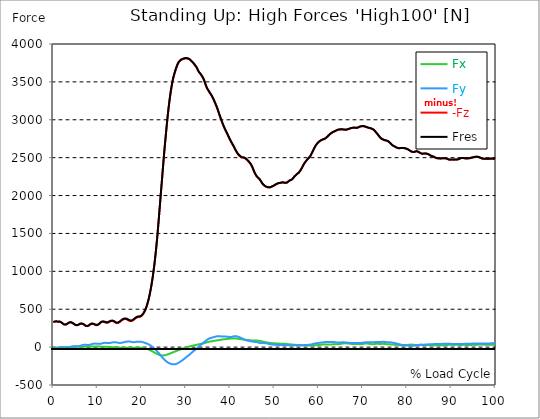
| Category |  Fx |  Fy |  -Fz |  Fres |
|---|---|---|---|---|
| 0.0 | -2.486 | -16.897 | 330.378 | 330.988 |
| 0.167348456675344 | -2.66 | -15.938 | 332.776 | 333.299 |
| 0.334696913350688 | -3.358 | -15.131 | 337.093 | 337.573 |
| 0.5020453700260321 | -3.99 | -14.106 | 340.407 | 340.821 |
| 0.669393826701376 | -4.361 | -12.449 | 340.581 | 340.93 |
| 0.83674228337672 | -3.881 | -12.384 | 336.853 | 337.202 |
| 1.0040907400520642 | -3.597 | -12.428 | 334.302 | 334.629 |
| 1.1621420602454444 | -4.252 | -11.054 | 336.831 | 337.136 |
| 1.3294905169207885 | -4.644 | -9.528 | 337.573 | 337.834 |
| 1.4968389735961325 | -4.6 | -7.936 | 335.261 | 335.501 |
| 1.6641874302714765 | -4.186 | -6.715 | 330.814 | 331.01 |
| 1.8315358869468206 | -3.423 | -6.061 | 325.123 | 325.298 |
| 1.9988843436221646 | -2.333 | -5.167 | 317.143 | 317.296 |
| 2.1662328002975086 | -0.938 | -5.56 | 308.989 | 309.142 |
| 2.333581256972853 | 0.414 | -6.715 | 302.252 | 302.426 |
| 2.5009297136481967 | 1.461 | -8.459 | 297.87 | 298.109 |
| 2.6682781703235405 | 2.049 | -9.506 | 296.823 | 297.107 |
| 2.8356266269988843 | 2.551 | -10.269 | 298.655 | 298.96 |
| 3.002975083674229 | 2.66 | -9.898 | 302.514 | 302.841 |
| 3.1703235403495724 | 2.551 | -8.83 | 308.771 | 309.076 |
| 3.337671997024917 | 1.81 | -6.432 | 316.293 | 316.533 |
| 3.4957233172182973 | 1.003 | -3.815 | 322.812 | 322.986 |
| 3.663071773893641 | 0.501 | -0.414 | 326.17 | 326.344 |
| 3.8304202305689854 | 0.131 | 3.052 | 328.285 | 328.459 |
| 3.997768687244329 | 0.087 | 6.061 | 327.173 | 327.412 |
| 4.165117143919673 | 0.262 | 8.307 | 324.055 | 324.338 |
| 4.332465600595017 | 0.589 | 10.618 | 319.193 | 319.563 |
| 4.499814057270361 | 1.134 | 11.948 | 312.652 | 313.11 |
| 4.667162513945706 | 2.071 | 12.667 | 304.367 | 304.934 |
| 4.834510970621049 | 3.009 | 12.929 | 297.194 | 297.826 |
| 5.001859427296393 | 3.881 | 12.079 | 292.07 | 292.702 |
| 5.169207883971737 | 4.688 | 11.01 | 288.582 | 289.214 |
| 5.336556340647081 | 5.189 | 10.16 | 288.887 | 289.541 |
| 5.503904797322425 | 5.385 | 9.746 | 290.784 | 291.46 |
| 5.671253253997769 | 5.472 | 10.226 | 294.686 | 295.406 |
| 5.82930457419115 | 5.124 | 12.275 | 300.53 | 301.336 |
| 5.996653030866494 | 4.709 | 15.611 | 306.438 | 307.506 |
| 6.164001487541838 | 4.295 | 18.968 | 309.425 | 310.711 |
| 6.331349944217181 | 3.968 | 22.086 | 310.821 | 312.259 |
| 6.498698400892526 | 4.034 | 25.051 | 308.793 | 310.45 |
| 6.66604685756787 | 4.273 | 27.82 | 305.719 | 307.615 |
| 6.833395314243213 | 4.753 | 29.586 | 300.791 | 302.884 |
| 7.000743770918558 | 5.538 | 31.091 | 294.098 | 296.322 |
| 7.168092227593902 | 6.475 | 30.938 | 286.489 | 288.734 |
| 7.335440684269246 | 7.391 | 30.611 | 279.272 | 281.561 |
| 7.50278914094459 | 7.871 | 29.87 | 276.961 | 279.206 |
| 7.6701375976199335 | 8.089 | 28.91 | 276.677 | 278.858 |
| 7.837486054295278 | 8.241 | 29.238 | 278.988 | 281.103 |
| 7.995537374488658 | 8.22 | 29.15 | 284.199 | 286.292 |
| 8.162885831164003 | 7.914 | 30.197 | 291.547 | 293.727 |
| 8.330234287839346 | 7.435 | 32.639 | 299.592 | 301.99 |
| 8.49758274451469 | 7.064 | 35.495 | 305.937 | 308.64 |
| 8.664931201190035 | 7.108 | 38.547 | 307.703 | 310.799 |
| 8.832279657865378 | 7.173 | 41.513 | 307.376 | 310.864 |
| 8.999628114540721 | 7.391 | 44.02 | 305.566 | 309.447 |
| 9.166976571216066 | 7.653 | 45.764 | 302.056 | 306.242 |
| 9.334325027891412 | 8.067 | 46.68 | 297.019 | 301.38 |
| 9.501673484566755 | 8.394 | 46.287 | 291.59 | 295.973 |
| 9.669021941242098 | 8.547 | 45.502 | 289.127 | 293.422 |
| 9.836370397917442 | 8.656 | 44.216 | 288.255 | 292.397 |
| 10.003718854592787 | 8.547 | 43.497 | 290.522 | 294.556 |
| 10.17106731126813 | 8.154 | 42.908 | 295.646 | 299.548 |
| 10.329118631461512 | 7.718 | 43.039 | 302.95 | 306.896 |
| 10.496467088136853 | 7.195 | 43.431 | 312.412 | 316.337 |
| 10.663815544812199 | 6.541 | 44.325 | 322.463 | 326.497 |
| 10.831164001487544 | 6.039 | 46.484 | 329.309 | 333.539 |
| 10.998512458162887 | 5.669 | 49.165 | 333.343 | 337.9 |
| 11.16586091483823 | 5.582 | 52.021 | 334.847 | 339.818 |
| 11.333209371513574 | 5.603 | 54.398 | 334.28 | 339.6 |
| 11.50055782818892 | 5.647 | 56.077 | 332.1 | 337.747 |
| 11.667906284864264 | 5.734 | 56.687 | 327.805 | 333.648 |
| 11.835254741539607 | 5.603 | 56.382 | 323.597 | 329.462 |
| 12.00260319821495 | 5.254 | 55.51 | 320.763 | 326.519 |
| 12.169951654890292 | 4.644 | 53.962 | 320.937 | 326.344 |
| 12.337300111565641 | 3.859 | 52.981 | 323.095 | 328.241 |
| 12.504648568240984 | 2.9 | 52.741 | 327.347 | 332.318 |
| 12.662699888434362 | 1.875 | 53.177 | 333.604 | 338.51 |
| 12.830048345109708 | 0.85 | 54.921 | 338.684 | 343.808 |
| 12.997396801785053 | -0.131 | 56.949 | 342.805 | 348.212 |
| 13.164745258460396 | -0.829 | 59.238 | 344.746 | 350.567 |
| 13.33209371513574 | -1.156 | 61.353 | 344.026 | 350.262 |
| 13.499442171811083 | -1.395 | 63.097 | 341.628 | 348.278 |
| 13.666790628486426 | -1.701 | 64.275 | 337.529 | 344.506 |
| 13.834139085161771 | -1.57 | 64.907 | 331.359 | 338.532 |
| 14.001487541837117 | -1.199 | 64.427 | 323.989 | 331.163 |
| 14.16883599851246 | -1.548 | 62.661 | 319.149 | 326.104 |
| 14.336184455187803 | -2.507 | 61.179 | 316.446 | 323.248 |
| 14.503532911863147 | -3.663 | 59.173 | 317.296 | 323.837 |
| 14.670881368538492 | -4.818 | 57.211 | 319.781 | 326.039 |
| 14.828932688731873 | -5.909 | 55.75 | 324.818 | 330.835 |
| 14.996281145407215 | -6.824 | 54.856 | 331.402 | 337.245 |
| 15.163629602082558 | -7.391 | 55.139 | 339.513 | 345.378 |
| 15.330978058757903 | -8.307 | 56.317 | 348.278 | 354.273 |
| 15.498326515433247 | -8.961 | 58.017 | 355.451 | 361.599 |
| 15.665674972108594 | -9.419 | 60.001 | 361.643 | 368.009 |
| 15.833023428783937 | -9.506 | 62.596 | 366.854 | 373.613 |
| 16.00037188545928 | -9.615 | 65.038 | 369.841 | 376.905 |
| 16.167720342134626 | -9.441 | 67.654 | 370.669 | 378.213 |
| 16.335068798809967 | -9.135 | 69.878 | 370.102 | 378.038 |
| 16.502417255485312 | -8.59 | 71.927 | 367.835 | 376.185 |
| 16.669765712160658 | -8.023 | 73.65 | 363.823 | 372.588 |
| 16.837114168836 | -7.435 | 74.457 | 358.46 | 367.486 |
| 17.004462625511344 | -6.759 | 74.74 | 352.355 | 361.49 |
| 17.16251394570472 | -6.17 | 74.282 | 346.468 | 355.603 |
| 17.32986240238007 | -5.996 | 73.366 | 343.677 | 352.813 |
| 17.497210859055414 | -6.148 | 71.186 | 342.282 | 351.112 |
| 17.664559315730756 | -6.628 | 68.875 | 343.721 | 352.159 |
| 17.8319077724061 | -7.26 | 66.608 | 346.948 | 354.884 |
| 17.999256229081443 | -7.849 | 64.754 | 352.922 | 360.509 |
| 18.166604685756788 | -8.307 | 64.253 | 360.008 | 367.333 |
| 18.333953142432133 | -8.285 | 65.626 | 369.601 | 376.992 |
| 18.501301599107478 | -8.023 | 67.589 | 378.605 | 386.171 |
| 18.668650055782823 | -7.653 | 69.376 | 384.427 | 392.254 |
| 18.835998512458165 | -7.587 | 70.009 | 389.965 | 397.966 |
| 19.00334696913351 | -7.457 | 70.924 | 394.042 | 402.261 |
| 19.170695425808855 | -6.999 | 72.233 | 396.222 | 404.66 |
| 19.338043882484197 | -6.693 | 72.124 | 397.399 | 405.772 |
| 19.496095202677576 | -6.41 | 71.862 | 398.511 | 406.775 |
| 19.66344365935292 | -7.173 | 71.709 | 400.212 | 408.388 |
| 19.830792116028263 | -8.154 | 70.423 | 405.684 | 413.533 |
| 19.998140572703612 | -9.244 | 67.981 | 413.882 | 421.252 |
| 20.165489029378953 | -10.596 | 65.321 | 424.609 | 431.39 |
| 20.3328374860543 | -11.904 | 62.836 | 438.585 | 444.755 |
| 20.500185942729644 | -13.67 | 60.132 | 455.613 | 461.369 |
| 20.667534399404985 | -15.72 | 57.189 | 473.927 | 479.291 |
| 20.83488285608033 | -17.856 | 53.809 | 495.752 | 500.701 |
| 21.002231312755672 | -20.407 | 50.146 | 521.283 | 525.774 |
| 21.16957976943102 | -23.416 | 46.287 | 550.738 | 554.837 |
| 21.336928226106362 | -26.796 | 42.232 | 584.184 | 587.999 |
| 21.504276682781704 | -30.24 | 37.806 | 621.336 | 624.911 |
| 21.67162513945705 | -33.947 | 32.726 | 661.627 | 665.094 |
| 21.82967645965043 | -38.569 | 26.708 | 707.5 | 710.836 |
| 21.997024916325774 | -43.562 | 20.189 | 758.105 | 761.244 |
| 22.16437337300112 | -48.686 | 13.322 | 812.459 | 815.511 |
| 22.33172182967646 | -54.136 | 5.821 | 872.809 | 875.905 |
| 22.499070286351806 | -59.74 | -2.006 | 937.215 | 940.398 |
| 22.666418743027148 | -65.343 | -10.509 | 1008.052 | 1011.388 |
| 22.833767199702496 | -70.968 | -19.579 | 1084.318 | 1087.915 |
| 23.00111565637784 | -76.441 | -29.085 | 1167.365 | 1171.289 |
| 23.168464113053183 | -81.76 | -38.744 | 1256.56 | 1260.79 |
| 23.335812569728528 | -87.037 | -48.598 | 1353.168 | 1357.768 |
| 23.50316102640387 | -92.226 | -58.802 | 1455.358 | 1460.307 |
| 23.670509483079215 | -96.935 | -69.267 | 1570.585 | 1575.905 |
| 23.83785793975456 | -100.881 | -79.188 | 1685.879 | 1691.525 |
| 23.995909259947936 | -104.544 | -90.264 | 1805.009 | 1811.07 |
| 24.163257716623285 | -107.204 | -101.492 | 1923.551 | 1930.004 |
| 24.330606173298627 | -108.643 | -113.614 | 2046.191 | 2052.994 |
| 24.49795462997397 | -109.69 | -125.846 | 2164.21 | 2171.383 |
| 24.665303086649313 | -109.908 | -138.121 | 2282.534 | 2290.056 |
| 24.83265154332466 | -109.69 | -148.695 | 2402.994 | 2410.756 |
| 25.0 | -108.992 | -159.487 | 2521.252 | 2529.276 |
| 25.167348456675345 | -107.488 | -169.059 | 2631.291 | 2639.532 |
| 25.334696913350694 | -105.525 | -177.954 | 2735.901 | 2744.295 |
| 25.502045370026035 | -102.604 | -186.283 | 2839.944 | 2848.468 |
| 25.669393826701377 | -99.791 | -193.87 | 2940.563 | 2949.176 |
| 25.836742283376722 | -96.913 | -200.891 | 3036.125 | 3044.824 |
| 26.004090740052067 | -93.774 | -206.996 | 3124.317 | 3133.082 |
| 26.17143919672741 | -90.133 | -212.228 | 3205.794 | 3214.581 |
| 26.329490516920792 | -86.121 | -216.829 | 3281.842 | 3290.651 |
| 26.49683897359613 | -82.044 | -220.666 | 3352.069 | 3360.878 |
| 26.66418743027148 | -77.923 | -223.173 | 3412.659 | 3421.402 |
| 26.831535886946828 | -73.781 | -225.332 | 3468.583 | 3477.283 |
| 26.998884343622166 | -69.66 | -227.338 | 3519.733 | 3528.367 |
| 27.166232800297514 | -65.735 | -228.21 | 3560.635 | 3569.16 |
| 27.333581256972852 | -61.898 | -227.556 | 3596.696 | 3605.069 |
| 27.5009297136482 | -58.083 | -226.684 | 3630.164 | 3638.383 |
| 27.668278170323543 | -54.267 | -224.176 | 3660.491 | 3668.428 |
| 27.835626626998888 | -50.691 | -220.906 | 3689.838 | 3697.469 |
| 28.002975083674233 | -46.353 | -216.175 | 3715.805 | 3723.087 |
| 28.170323540349575 | -42.21 | -211.16 | 3737.76 | 3744.716 |
| 28.33767199702492 | -38.264 | -206.036 | 3755.072 | 3761.744 |
| 28.50502045370026 | -34.405 | -200.586 | 3768.611 | 3775 |
| 28.663071773893645 | -30.502 | -193.805 | 3779.382 | 3785.509 |
| 28.830420230568986 | -26.861 | -187.395 | 3786.86 | 3792.66 |
| 28.99776868724433 | -23.394 | -180.483 | 3793.445 | 3799.005 |
| 29.165117143919673 | -20.211 | -173.79 | 3797.609 | 3802.929 |
| 29.33246560059502 | -16.832 | -166.421 | 3801.337 | 3806.439 |
| 29.499814057270367 | -13.649 | -158.528 | 3804.935 | 3809.928 |
| 29.66716251394571 | -10.662 | -150.483 | 3807.769 | 3812.718 |
| 29.834510970621054 | -7.609 | -143.026 | 3809.753 | 3814.615 |
| 30.00185942729639 | -4.208 | -135.243 | 3810.189 | 3814.833 |
| 30.169207883971744 | -1.156 | -127.481 | 3809.971 | 3814.463 |
| 30.33655634064708 | 1.526 | -119.675 | 3808.14 | 3812.566 |
| 30.50390479732243 | 3.794 | -112.502 | 3805 | 3809.383 |
| 30.671253253997772 | 6.497 | -103.977 | 3800.138 | 3804.324 |
| 30.829304574191156 | 8.787 | -96.019 | 3794.382 | 3798.416 |
| 30.996653030866494 | 11.904 | -87.713 | 3785.029 | 3788.91 |
| 31.164001487541842 | 14.477 | -78.577 | 3776.242 | 3779.971 |
| 31.331349944217187 | 17.093 | -70.161 | 3766.911 | 3770.661 |
| 31.498698400892525 | 19.535 | -61.615 | 3756.707 | 3760.501 |
| 31.666046857567874 | 21.672 | -53.831 | 3745.675 | 3749.556 |
| 31.833395314243212 | 23.503 | -47.072 | 3734.098 | 3738.088 |
| 32.00074377091856 | 25.814 | -38.962 | 3719.948 | 3723.807 |
| 32.1680922275939 | 28.038 | -29.172 | 3706.953 | 3710.769 |
| 32.33544068426925 | 30.306 | -20.277 | 3694.831 | 3698.712 |
| 32.50278914094459 | 32.05 | -13.343 | 3676.538 | 3680.397 |
| 32.670137597619934 | 33.576 | -4.927 | 3654.823 | 3658.638 |
| 32.83748605429528 | 35.975 | 4.426 | 3636.944 | 3640.716 |
| 33.004834510970625 | 38.46 | 13.801 | 3622.097 | 3625.869 |
| 33.162885831164004 | 40.553 | 22.239 | 3609.189 | 3613.179 |
| 33.33023428783935 | 42.319 | 30.306 | 3598.768 | 3603.063 |
| 33.497582744514695 | 44.194 | 38.242 | 3586.122 | 3590.613 |
| 33.664931201190036 | 46.2 | 45.829 | 3568.833 | 3573.477 |
| 33.83227965786538 | 48.162 | 53.242 | 3550.889 | 3555.729 |
| 33.99962811454073 | 50.168 | 60.35 | 3531.833 | 3536.87 |
| 34.16697657121607 | 53.33 | 67.981 | 3505.604 | 3510.51 |
| 34.33432502789141 | 56.665 | 76.114 | 3477.195 | 3481.883 |
| 34.50167348456676 | 60.11 | 84.486 | 3450.247 | 3454.695 |
| 34.6690219412421 | 63.315 | 93.294 | 3425.109 | 3429.382 |
| 34.83637039791744 | 65.91 | 101.448 | 3405.05 | 3409.323 |
| 35.00371885459279 | 67.632 | 106.485 | 3389.897 | 3394.41 |
| 35.17106731126814 | 69.594 | 110.366 | 3374.439 | 3379.214 |
| 35.338415767943474 | 72.451 | 116.056 | 3356.735 | 3361.619 |
| 35.49646708813686 | 74.675 | 119.218 | 3342.65 | 3347.665 |
| 35.6638155448122 | 76.31 | 121.747 | 3329.154 | 3334.235 |
| 35.831164001487544 | 77.749 | 125.126 | 3311.254 | 3316.422 |
| 35.998512458162885 | 79.21 | 128.527 | 3293.333 | 3298.609 |
| 36.165860914838234 | 80.845 | 130.315 | 3272.685 | 3278.136 |
| 36.333209371513576 | 82.567 | 132.43 | 3251.231 | 3256.813 |
| 36.50055782818892 | 84.311 | 135.722 | 3228.796 | 3234.487 |
| 36.667906284864266 | 86.034 | 138.142 | 3205.882 | 3211.681 |
| 36.83525474153961 | 87.756 | 140.628 | 3182.226 | 3188.156 |
| 37.002603198214956 | 89.173 | 142.808 | 3157.327 | 3163.41 |
| 37.1699516548903 | 90.22 | 142.983 | 3129.136 | 3135.328 |
| 37.337300111565646 | 91.419 | 143.026 | 3099.855 | 3106.134 |
| 37.50464856824098 | 93.032 | 142.786 | 3071.315 | 3077.703 |
| 37.66269988843437 | 95.104 | 142.263 | 3043.538 | 3050.013 |
| 37.83004834510971 | 97.044 | 141.718 | 3016.328 | 3022.934 |
| 37.99739680178505 | 98.658 | 141.02 | 2990.579 | 2997.294 |
| 38.16474525846039 | 100.62 | 140.257 | 2963.108 | 2969.954 |
| 38.33209371513574 | 101.666 | 139.581 | 2937.424 | 2944.27 |
| 38.49944217181109 | 102.735 | 139.69 | 2912.83 | 2919.72 |
| 38.666790628486424 | 103.825 | 140.17 | 2890.33 | 2897.22 |
| 38.83413908516178 | 104.784 | 140.584 | 2869.203 | 2876.158 |
| 39.001487541837115 | 105.874 | 140.083 | 2848.926 | 2855.925 |
| 39.16883599851246 | 107.161 | 138.426 | 2828.824 | 2835.845 |
| 39.336184455187805 | 107.989 | 136.224 | 2808.896 | 2815.939 |
| 39.503532911863154 | 109.755 | 135.155 | 2788.38 | 2795.531 |
| 39.670881368538495 | 111.151 | 134.894 | 2767.449 | 2774.688 |
| 39.83822982521384 | 111.805 | 134.894 | 2746.737 | 2753.975 |
| 39.996281145407224 | 112.197 | 134.85 | 2727.354 | 2734.571 |
| 40.163629602082565 | 112.219 | 134.283 | 2709.323 | 2716.496 |
| 40.33097805875791 | 112.132 | 133.542 | 2691.772 | 2698.901 |
| 40.498326515433256 | 112.699 | 135.417 | 2673.632 | 2680.783 |
| 40.6656749721086 | 114.748 | 140.999 | 2656.146 | 2663.45 |
| 40.83302342878393 | 115.446 | 144.247 | 2639.511 | 2646.945 |
| 41.00037188545929 | 115.489 | 144.989 | 2618.427 | 2625.971 |
| 41.16772034213463 | 114.792 | 144.247 | 2599.154 | 2606.763 |
| 41.33506879880997 | 113.571 | 143.201 | 2582.06 | 2589.648 |
| 41.50241725548531 | 112.481 | 142.241 | 2564.901 | 2572.467 |
| 41.66976571216066 | 110.366 | 139.472 | 2550.751 | 2558.208 |
| 41.837114168836 | 109.254 | 136.725 | 2537.234 | 2544.559 |
| 42.004462625511344 | 108.142 | 133.128 | 2527.531 | 2534.748 |
| 42.17181108218669 | 106.594 | 128.68 | 2519.05 | 2526.114 |
| 42.32986240238007 | 104.98 | 123.753 | 2512.161 | 2519.05 |
| 42.497210859055414 | 104.261 | 120.569 | 2503.439 | 2510.176 |
| 42.66455931573076 | 102.866 | 115.446 | 2501.368 | 2507.8 |
| 42.831907772406105 | 101.405 | 109.93 | 2499.842 | 2505.99 |
| 42.999256229081446 | 99.944 | 104.501 | 2498.25 | 2504.093 |
| 43.16660468575679 | 98.113 | 99.988 | 2495.83 | 2501.455 |
| 43.33395314243214 | 96.303 | 95.474 | 2493.41 | 2498.817 |
| 43.50130159910748 | 95.671 | 92.618 | 2485.365 | 2490.663 |
| 43.66865005578282 | 95.235 | 90.024 | 2476.448 | 2481.68 |
| 43.83599851245817 | 95.017 | 87.102 | 2466.702 | 2471.847 |
| 44.00334696913351 | 94.82 | 84.137 | 2456.825 | 2461.883 |
| 44.17069542580886 | 93.163 | 81.586 | 2447.036 | 2451.985 |
| 44.3380438824842 | 91.288 | 79.515 | 2436.309 | 2441.171 |
| 44.49609520267758 | 89.675 | 77.771 | 2423.423 | 2428.242 |
| 44.66344365935292 | 88.192 | 76.223 | 2408.99 | 2413.765 |
| 44.83079211602827 | 87.015 | 75.023 | 2391.569 | 2396.301 |
| 44.99814057270361 | 86.492 | 74.108 | 2371.031 | 2375.828 |
| 45.16548902937895 | 87.211 | 73.105 | 2348.552 | 2353.436 |
| 45.332837486054295 | 88.345 | 71.295 | 2321.975 | 2326.88 |
| 45.500185942729644 | 89.152 | 69.573 | 2299.954 | 2304.86 |
| 45.66753439940499 | 88.912 | 67.959 | 2280.986 | 2285.826 |
| 45.83488285608033 | 87.669 | 66.259 | 2264.241 | 2268.929 |
| 46.00223131275568 | 86.339 | 65.91 | 2250.156 | 2254.757 |
| 46.16957976943102 | 84.922 | 64.907 | 2237.881 | 2242.329 |
| 46.336928226106366 | 84.137 | 61.942 | 2229.64 | 2233.826 |
| 46.50427668278171 | 82.916 | 57.189 | 2221.42 | 2225.214 |
| 46.671625139457056 | 81.782 | 53.264 | 2211.217 | 2214.727 |
| 46.829676459650436 | 80.147 | 51.062 | 2198.92 | 2202.19 |
| 46.99702491632577 | 77.727 | 52.109 | 2182.502 | 2185.598 |
| 47.16437337300112 | 75.394 | 54.878 | 2164.515 | 2167.458 |
| 47.33172182967646 | 73.148 | 54.66 | 2152.088 | 2154.9 |
| 47.49907028635181 | 70.946 | 54.093 | 2141.949 | 2144.653 |
| 47.66641874302716 | 68.766 | 53.351 | 2133.621 | 2136.237 |
| 47.83376719970249 | 66.738 | 52 | 2125.728 | 2128.235 |
| 48.001115656377834 | 64.667 | 50.539 | 2118.62 | 2121.019 |
| 48.16846411305319 | 62.4 | 48.642 | 2114.172 | 2116.44 |
| 48.33581256972853 | 60.459 | 48.228 | 2110.858 | 2113.039 |
| 48.50316102640387 | 59.064 | 45.786 | 2108.722 | 2110.771 |
| 48.67050948307921 | 57.821 | 43.409 | 2107.414 | 2109.376 |
| 48.837857939754564 | 56.862 | 41.142 | 2107.392 | 2109.289 |
| 49.005206396429905 | 55.837 | 39.071 | 2108.155 | 2110.008 |
| 49.163257716623285 | 54.616 | 37.653 | 2111.273 | 2113.061 |
| 49.33060617329863 | 53.286 | 36.28 | 2115.764 | 2117.487 |
| 49.49795462997397 | 52.239 | 34.71 | 2121.433 | 2123.068 |
| 49.66530308664932 | 51.629 | 32.966 | 2126.556 | 2128.17 |
| 49.832651543324666 | 50.19 | 31.723 | 2130.067 | 2131.615 |
| 50.0 | 49.95 | 31.309 | 2136.302 | 2137.829 |
| 50.16734845667534 | 49.034 | 30.349 | 2142.233 | 2143.737 |
| 50.33469691335069 | 48.991 | 30.044 | 2148.795 | 2150.343 |
| 50.50204537002604 | 49.056 | 29.63 | 2154.399 | 2155.925 |
| 50.66939382670139 | 48.664 | 28.627 | 2157.582 | 2159.108 |
| 50.836742283376715 | 47.792 | 27.559 | 2160.983 | 2162.509 |
| 51.00409074005207 | 47.029 | 26.926 | 2166.063 | 2167.589 |
| 51.17143919672741 | 46.331 | 26.338 | 2165.845 | 2167.371 |
| 51.32949051692079 | 45.219 | 26.599 | 2165.431 | 2166.935 |
| 51.496838973596134 | 45.154 | 26.381 | 2169.312 | 2170.794 |
| 51.66418743027148 | 45.808 | 26.36 | 2172.146 | 2173.629 |
| 51.831535886946824 | 44.827 | 26.512 | 2173.803 | 2175.264 |
| 51.99888434362217 | 44.216 | 26.992 | 2171.732 | 2173.149 |
| 52.16623280029752 | 43.518 | 27.515 | 2169.573 | 2170.903 |
| 52.33358125697285 | 42.799 | 28.235 | 2168.396 | 2169.682 |
| 52.5009297136482 | 42.079 | 29.063 | 2167.786 | 2168.963 |
| 52.668278170323546 | 41.491 | 28.256 | 2167.698 | 2168.788 |
| 52.835626626998895 | 40.466 | 26.49 | 2171.209 | 2172.233 |
| 53.00297508367424 | 38.983 | 25.531 | 2178.578 | 2179.559 |
| 53.17032354034958 | 37.741 | 25.596 | 2187.43 | 2188.346 |
| 53.33767199702492 | 37.588 | 26.687 | 2195.628 | 2196.5 |
| 53.50502045370027 | 37.261 | 25.705 | 2200.926 | 2201.754 |
| 53.663071773893655 | 36.563 | 24.463 | 2204.371 | 2205.156 |
| 53.83042023056899 | 35.735 | 23.656 | 2208.775 | 2209.538 |
| 53.99776868724433 | 34.427 | 23.416 | 2215.991 | 2216.733 |
| 54.16511714391967 | 32.857 | 23.264 | 2225.628 | 2226.37 |
| 54.33246560059503 | 31.44 | 23.852 | 2237.598 | 2238.318 |
| 54.49981405727037 | 30.349 | 24.376 | 2251.05 | 2251.748 |
| 54.667162513945705 | 30.022 | 23.918 | 2260.556 | 2261.276 |
| 54.834510970621054 | 29.347 | 22.849 | 2268.907 | 2269.626 |
| 55.0018594272964 | 28.649 | 22.37 | 2278.914 | 2279.634 |
| 55.169207883971744 | 28.627 | 22.282 | 2287.57 | 2288.29 |
| 55.336556340647086 | 29.674 | 22.588 | 2293.261 | 2294.002 |
| 55.50390479732243 | 29.521 | 22.631 | 2302.745 | 2303.464 |
| 55.671253253997776 | 28.91 | 23.176 | 2315.085 | 2315.826 |
| 55.83860171067312 | 27.123 | 23.307 | 2329.606 | 2330.303 |
| 55.9966530308665 | 25.182 | 23.242 | 2343.821 | 2344.519 |
| 56.16400148754184 | 23.983 | 23.721 | 2362.201 | 2362.899 |
| 56.33134994421718 | 23.983 | 24.703 | 2380.777 | 2381.496 |
| 56.498698400892536 | 24.157 | 26.098 | 2398.982 | 2399.724 |
| 56.66604685756788 | 23.939 | 27.341 | 2416.468 | 2417.231 |
| 56.83339531424321 | 23.242 | 27.602 | 2431.534 | 2432.319 |
| 57.00074377091856 | 23.024 | 27.886 | 2445.03 | 2445.836 |
| 57.16809222759391 | 22.37 | 27.995 | 2457.806 | 2458.591 |
| 57.33544068426925 | 21.803 | 28.627 | 2470.125 | 2470.91 |
| 57.5027891409446 | 21.301 | 29.565 | 2482.16 | 2482.945 |
| 57.670137597619934 | 22.13 | 30.611 | 2491.012 | 2491.819 |
| 57.83748605429528 | 22.021 | 31.331 | 2500.365 | 2501.172 |
| 58.004834510970625 | 21.171 | 31.832 | 2512.662 | 2513.512 |
| 58.16288583116401 | 20.8 | 32.726 | 2527.401 | 2528.295 |
| 58.330234287839346 | 20.407 | 34.71 | 2546.653 | 2547.59 |
| 58.497582744514695 | 21.585 | 37.632 | 2565.883 | 2566.951 |
| 58.66493120119004 | 23.133 | 40.793 | 2585.113 | 2586.334 |
| 58.832279657865385 | 23.591 | 43.148 | 2605.738 | 2607.046 |
| 58.999628114540734 | 23.569 | 45.175 | 2626.887 | 2628.26 |
| 59.16697657121607 | 24.441 | 47.944 | 2644.002 | 2645.485 |
| 59.33432502789142 | 24.942 | 50.234 | 2661.379 | 2662.97 |
| 59.50167348456676 | 25.575 | 51.673 | 2674.264 | 2675.899 |
| 59.66902194124211 | 26.425 | 52.872 | 2686.212 | 2687.956 |
| 59.83637039791745 | 27.493 | 54.376 | 2696.917 | 2698.727 |
| 60.00371885459278 | 28.562 | 55.881 | 2706.707 | 2708.582 |
| 60.17106731126813 | 29.761 | 57.232 | 2715.275 | 2717.216 |
| 60.33841576794349 | 31.069 | 58.519 | 2721.772 | 2723.778 |
| 60.49646708813685 | 32.181 | 59.892 | 2727.812 | 2729.905 |
| 60.6638155448122 | 33.206 | 60.677 | 2732.587 | 2734.723 |
| 60.831164001487544 | 33.489 | 60.786 | 2736.729 | 2738.888 |
| 60.99851245816289 | 34.339 | 61.833 | 2740.763 | 2742.943 |
| 61.16586091483824 | 35.691 | 64.209 | 2744.186 | 2746.453 |
| 61.333209371513576 | 36.694 | 66.433 | 2747.805 | 2750.138 |
| 61.50055782818892 | 36.149 | 67.698 | 2752.994 | 2755.349 |
| 61.667906284864266 | 34.906 | 68.592 | 2760.472 | 2762.827 |
| 61.835254741539615 | 34.056 | 68.722 | 2768.539 | 2770.894 |
| 62.002603198214956 | 33.14 | 68.701 | 2778.743 | 2781.12 |
| 62.16995165489029 | 32.944 | 68.417 | 2789.383 | 2791.781 |
| 62.33730011156564 | 33.053 | 68.352 | 2798.584 | 2801.004 |
| 62.504648568240995 | 33.184 | 68.548 | 2806.673 | 2809.136 |
| 62.67199702491633 | 34.1 | 67.567 | 2815.895 | 2818.424 |
| 62.83004834510971 | 35.168 | 67.262 | 2823.177 | 2825.728 |
| 62.99739680178505 | 36.171 | 67.174 | 2829.391 | 2831.986 |
| 63.1647452584604 | 37.152 | 66.978 | 2835.365 | 2837.96 |
| 63.33209371513575 | 38.177 | 67.283 | 2840.227 | 2842.843 |
| 63.4994421718111 | 38.482 | 66.433 | 2843.781 | 2846.354 |
| 63.666790628486424 | 37.61 | 64.645 | 2848.098 | 2850.54 |
| 63.83413908516177 | 36.738 | 62.574 | 2853.2 | 2855.511 |
| 64.00148754183712 | 36.127 | 60.59 | 2858.65 | 2860.831 |
| 64.16883599851248 | 36.258 | 59.434 | 2863.861 | 2865.976 |
| 64.3361844551878 | 37.479 | 59.761 | 2867.59 | 2869.726 |
| 64.50353291186315 | 38.678 | 60.197 | 2869.726 | 2871.885 |
| 64.6708813685385 | 40.074 | 60.612 | 2870.925 | 2873.127 |
| 64.83822982521384 | 41.578 | 61.026 | 2871.906 | 2874.152 |
| 65.00557828188919 | 43.235 | 61.702 | 2872.321 | 2874.632 |
| 65.16362960208257 | 44.914 | 62.4 | 2872.626 | 2875.002 |
| 65.3309780587579 | 46.854 | 62.814 | 2872.364 | 2874.784 |
| 65.49832651543326 | 48.097 | 62.966 | 2871.536 | 2874 |
| 65.6656749721086 | 48.838 | 62.901 | 2870.031 | 2872.517 |
| 65.83302342878395 | 49.449 | 62.487 | 2868.527 | 2871.013 |
| 66.00037188545929 | 50.059 | 62.094 | 2867.044 | 2869.53 |
| 66.16772034213463 | 49.514 | 61.309 | 2867.262 | 2869.726 |
| 66.33506879880998 | 49.056 | 60.241 | 2869.138 | 2871.579 |
| 66.50241725548531 | 48.315 | 58.889 | 2871.95 | 2874.305 |
| 66.66976571216065 | 47.443 | 57.559 | 2875.482 | 2877.793 |
| 66.83711416883601 | 45.895 | 55.706 | 2879.08 | 2881.303 |
| 67.00446262551135 | 44.696 | 54.311 | 2882.742 | 2884.879 |
| 67.1718110821867 | 43.954 | 53.569 | 2886.449 | 2888.586 |
| 67.32986240238007 | 43.039 | 53.068 | 2888.934 | 2891.028 |
| 67.49721085905541 | 41.97 | 53.003 | 2891.376 | 2893.469 |
| 67.66455931573076 | 40.967 | 53.003 | 2893.644 | 2895.737 |
| 67.83190777240611 | 40.444 | 53.308 | 2894.647 | 2896.762 |
| 67.99925622908145 | 40.335 | 53.635 | 2894.69 | 2896.805 |
| 68.16660468575678 | 40.488 | 54.005 | 2894.015 | 2896.173 |
| 68.33395314243214 | 40.64 | 54.398 | 2893.339 | 2895.497 |
| 68.50130159910749 | 40.793 | 54.79 | 2892.641 | 2894.843 |
| 68.66865005578282 | 40.815 | 55.161 | 2893.775 | 2895.977 |
| 68.83599851245816 | 40.553 | 55.139 | 2895.977 | 2898.135 |
| 69.00334696913352 | 39.877 | 54.878 | 2899.247 | 2901.384 |
| 69.17069542580886 | 39.18 | 54.921 | 2904.087 | 2906.202 |
| 69.3380438824842 | 38.722 | 55.03 | 2909.909 | 2912.045 |
| 69.50539233915956 | 39.659 | 55.532 | 2912.263 | 2914.444 |
| 69.66344365935292 | 40.837 | 56.295 | 2913.593 | 2915.795 |
| 69.83079211602826 | 41.818 | 57.363 | 2914.923 | 2917.147 |
| 69.99814057270362 | 42.799 | 58.737 | 2914.923 | 2917.169 |
| 70.16548902937896 | 43.78 | 60.307 | 2914.008 | 2916.319 |
| 70.33283748605429 | 44.957 | 61.593 | 2912.089 | 2914.444 |
| 70.50018594272964 | 46.418 | 62.487 | 2908.884 | 2911.282 |
| 70.667534399405 | 46.898 | 63.163 | 2905.417 | 2907.837 |
| 70.83488285608033 | 46.767 | 63.708 | 2901.82 | 2904.196 |
| 71.00223131275568 | 46.658 | 64.231 | 2898.222 | 2900.577 |
| 71.16957976943102 | 45.415 | 64.166 | 2895.453 | 2897.721 |
| 71.33692822610637 | 44.151 | 64.078 | 2892.706 | 2894.908 |
| 71.50427668278171 | 42.777 | 63.926 | 2890.046 | 2892.161 |
| 71.67162513945706 | 41.338 | 63.708 | 2887.474 | 2889.523 |
| 71.8389735961324 | 39.877 | 63.49 | 2884.901 | 2886.863 |
| 71.99702491632577 | 38.765 | 63.555 | 2881.805 | 2883.724 |
| 72.16437337300113 | 38.111 | 64.035 | 2877.968 | 2879.864 |
| 72.33172182967647 | 38.373 | 64.405 | 2871.361 | 2873.258 |
| 72.49907028635181 | 39.092 | 65.169 | 2862.902 | 2864.777 |
| 72.66641874302715 | 40.575 | 65.91 | 2853.658 | 2855.576 |
| 72.8337671997025 | 41.818 | 66.346 | 2842.909 | 2844.871 |
| 73.00111565637783 | 42.93 | 67 | 2829.936 | 2831.964 |
| 73.16846411305319 | 43.627 | 67.371 | 2817.596 | 2819.645 |
| 73.33581256972853 | 43.475 | 67.174 | 2806.542 | 2808.591 |
| 73.50316102640387 | 42.995 | 68.09 | 2795.095 | 2797.167 |
| 73.67050948307921 | 42.581 | 68.57 | 2781.665 | 2783.736 |
| 73.83785793975457 | 42.232 | 68.592 | 2767.624 | 2769.673 |
| 74.00520639642991 | 41.84 | 68.526 | 2758.118 | 2760.145 |
| 74.16325771662328 | 42.297 | 68.788 | 2750.247 | 2752.275 |
| 74.33060617329863 | 42.908 | 69.137 | 2744.426 | 2746.453 |
| 74.49795462997398 | 42.842 | 69.18 | 2739.782 | 2741.744 |
| 74.66530308664932 | 42.777 | 69.224 | 2735.116 | 2737.056 |
| 74.83265154332466 | 42.472 | 68.853 | 2731.758 | 2733.655 |
| 75.00000000000001 | 40.946 | 67.218 | 2729.861 | 2731.649 |
| 75.16734845667534 | 38.744 | 65.844 | 2727.092 | 2728.815 |
| 75.3346969133507 | 37.523 | 64.623 | 2725.196 | 2726.831 |
| 75.50204537002605 | 37.152 | 64.449 | 2721.38 | 2722.993 |
| 75.66939382670138 | 37.174 | 64.493 | 2716.431 | 2718.022 |
| 75.83674228337672 | 36.759 | 64.122 | 2710.13 | 2711.678 |
| 76.00409074005208 | 36.716 | 64.296 | 2701.976 | 2703.502 |
| 76.17143919672742 | 36.738 | 64.144 | 2692.23 | 2693.712 |
| 76.33878765340276 | 35.364 | 61.462 | 2680.216 | 2681.59 |
| 76.49683897359614 | 35.211 | 60.023 | 2671.212 | 2672.498 |
| 76.66418743027148 | 35.015 | 58.933 | 2663.668 | 2664.911 |
| 76.83153588694682 | 34.078 | 57.101 | 2656.8 | 2657.978 |
| 76.99888434362218 | 32.486 | 55.881 | 2651.088 | 2652.2 |
| 77.16623280029752 | 32.53 | 54.834 | 2647.011 | 2648.123 |
| 77.33358125697285 | 32.617 | 52.152 | 2641.756 | 2642.803 |
| 77.5009297136482 | 32.072 | 48.315 | 2635.586 | 2636.524 |
| 77.66827817032356 | 31.025 | 45.895 | 2631.378 | 2632.25 |
| 77.83562662699889 | 29.935 | 43.213 | 2628.282 | 2629.089 |
| 78.00297508367423 | 28.453 | 41.273 | 2625.84 | 2626.56 |
| 78.17032354034959 | 27.21 | 38.874 | 2623.878 | 2624.554 |
| 78.33767199702493 | 25.945 | 36.258 | 2624.445 | 2625.077 |
| 78.50502045370027 | 25.4 | 33.773 | 2626.756 | 2627.366 |
| 78.67236891037561 | 25.226 | 31.374 | 2628.587 | 2629.22 |
| 78.83042023056899 | 25.771 | 29.216 | 2628.827 | 2629.46 |
| 78.99776868724433 | 26.643 | 28.038 | 2627.933 | 2628.609 |
| 79.16511714391969 | 27.101 | 25.64 | 2627.039 | 2627.737 |
| 79.33246560059503 | 27.297 | 23.721 | 2625.644 | 2626.364 |
| 79.49981405727036 | 27.166 | 22.413 | 2623.638 | 2624.336 |
| 79.66716251394571 | 27.537 | 21.519 | 2621.153 | 2621.85 |
| 79.83451097062107 | 28.453 | 21.105 | 2618.122 | 2618.82 |
| 80.00185942729641 | 28.976 | 20.298 | 2614.067 | 2614.764 |
| 80.16920788397174 | 29.216 | 19.274 | 2609.466 | 2610.142 |
| 80.33655634064709 | 30.415 | 18.925 | 2604.081 | 2604.779 |
| 80.50390479732243 | 31.985 | 19.361 | 2597.148 | 2597.845 |
| 80.67125325399778 | 32.508 | 19.056 | 2590.498 | 2591.196 |
| 80.83860171067312 | 33.009 | 18.772 | 2583.913 | 2584.611 |
| 80.99665303086651 | 33.271 | 19.056 | 2579.684 | 2580.36 |
| 81.16400148754184 | 32.639 | 19.056 | 2576.544 | 2577.198 |
| 81.3313499442172 | 31.134 | 18.75 | 2574.735 | 2575.345 |
| 81.49869840089255 | 29.804 | 18.663 | 2573.732 | 2574.277 |
| 81.66604685756786 | 29.456 | 20.56 | 2576.588 | 2577.089 |
| 81.83339531424322 | 28.3 | 22.544 | 2580.905 | 2581.384 |
| 82.00074377091858 | 27.123 | 23.896 | 2583.238 | 2583.717 |
| 82.16809222759392 | 26.054 | 25.008 | 2584.546 | 2585.004 |
| 82.33544068426926 | 26.817 | 25.858 | 2582.038 | 2582.518 |
| 82.50278914094459 | 28.104 | 26.883 | 2577.656 | 2578.136 |
| 82.67013759761994 | 29.172 | 27.973 | 2572.358 | 2572.859 |
| 82.83748605429528 | 30.568 | 29.499 | 2565.926 | 2566.428 |
| 83.00483451097062 | 31.461 | 30.698 | 2560.018 | 2560.541 |
| 83.17218296764597 | 30.873 | 31.047 | 2555.722 | 2556.246 |
| 83.33023428783935 | 29.281 | 30.807 | 2552.67 | 2553.172 |
| 83.4975827445147 | 28.365 | 31.047 | 2551.384 | 2551.863 |
| 83.66493120119004 | 27.842 | 31.374 | 2552.038 | 2552.517 |
| 83.83227965786537 | 27.319 | 32.181 | 2554.785 | 2555.265 |
| 83.99962811454073 | 27.057 | 33.097 | 2556.987 | 2557.467 |
| 84.16697657121607 | 27.45 | 33.947 | 2556.159 | 2556.66 |
| 84.33432502789142 | 28.191 | 34.993 | 2553.608 | 2554.153 |
| 84.50167348456677 | 27.232 | 35.342 | 2550.621 | 2551.166 |
| 84.6690219412421 | 26.185 | 35.669 | 2547.634 | 2548.157 |
| 84.83637039791745 | 26.621 | 36.956 | 2544.472 | 2545.017 |
| 85.0037188545928 | 27.297 | 37.653 | 2539.479 | 2540.046 |
| 85.17106731126813 | 26.948 | 37.893 | 2532.197 | 2532.786 |
| 85.33841576794349 | 26.621 | 38.024 | 2525.918 | 2526.507 |
| 85.50576422461883 | 25.989 | 37.719 | 2521.623 | 2522.19 |
| 85.66381554481221 | 25.008 | 37.588 | 2518.178 | 2518.745 |
| 85.83116400148755 | 24.485 | 38.242 | 2516.172 | 2516.717 |
| 85.99851245816289 | 25.117 | 39.528 | 2512.204 | 2512.793 |
| 86.16586091483823 | 25.945 | 40.749 | 2507.429 | 2508.062 |
| 86.33320937151358 | 25.814 | 41.185 | 2501.564 | 2502.218 |
| 86.50055782818893 | 25.335 | 41.556 | 2496.855 | 2497.509 |
| 86.66790628486427 | 24.79 | 41.927 | 2493.999 | 2494.631 |
| 86.83525474153961 | 24.659 | 42.123 | 2491.23 | 2491.884 |
| 87.00260319821496 | 23.983 | 42.254 | 2489.878 | 2490.532 |
| 87.16995165489031 | 23.809 | 42.406 | 2490.51 | 2491.143 |
| 87.33730011156564 | 24.332 | 42.428 | 2490.314 | 2490.946 |
| 87.504648568241 | 24.637 | 42.276 | 2489.682 | 2490.336 |
| 87.67199702491634 | 24.506 | 42.363 | 2489.834 | 2490.489 |
| 87.83004834510972 | 24.179 | 42.559 | 2490.489 | 2491.143 |
| 87.99739680178506 | 24.07 | 43.3 | 2491.928 | 2492.582 |
| 88.1647452584604 | 24.724 | 43.671 | 2492.647 | 2493.323 |
| 88.33209371513574 | 25.073 | 43.78 | 2493.039 | 2493.715 |
| 88.49944217181108 | 25.313 | 43.627 | 2492.582 | 2493.258 |
| 88.66679062848644 | 25.771 | 43.867 | 2491.513 | 2492.189 |
| 88.83413908516178 | 26.12 | 43.976 | 2489.05 | 2489.747 |
| 89.00148754183712 | 27.864 | 44.172 | 2485.997 | 2486.673 |
| 89.16883599851246 | 29.63 | 44.216 | 2481.201 | 2481.876 |
| 89.33618445518782 | 30.698 | 43.889 | 2475.902 | 2476.6 |
| 89.50353291186315 | 30.786 | 43.497 | 2473.918 | 2474.616 |
| 89.6708813685385 | 30.807 | 43.17 | 2473.395 | 2474.093 |
| 89.83822982521386 | 30.829 | 42.886 | 2473.897 | 2474.616 |
| 90.00557828188919 | 30.895 | 42.624 | 2474.507 | 2475.205 |
| 90.16362960208257 | 30.153 | 41.818 | 2474.464 | 2475.139 |
| 90.3309780587579 | 29.63 | 41.556 | 2474.115 | 2474.791 |
| 90.49832651543326 | 29.303 | 41.534 | 2473.657 | 2474.333 |
| 90.66567497210859 | 29.216 | 41.513 | 2473.918 | 2474.616 |
| 90.83302342878395 | 29.456 | 41.578 | 2474.398 | 2475.096 |
| 91.00037188545929 | 29.913 | 41.796 | 2474.027 | 2474.725 |
| 91.16772034213463 | 30.502 | 42.319 | 2474.878 | 2475.619 |
| 91.33506879880998 | 30.807 | 42.494 | 2475.815 | 2476.557 |
| 91.50241725548533 | 30.022 | 42.079 | 2477.45 | 2478.192 |
| 91.66976571216065 | 28.801 | 41.6 | 2480.525 | 2481.244 |
| 91.83711416883601 | 27.559 | 41.164 | 2485.583 | 2486.302 |
| 92.00446262551137 | 26.73 | 40.88 | 2491.252 | 2491.993 |
| 92.1718110821867 | 26.861 | 41.185 | 2494.871 | 2495.612 |
| 92.33915953886203 | 27.995 | 41.752 | 2496.288 | 2497.051 |
| 92.49721085905541 | 29.521 | 42.21 | 2495.961 | 2496.768 |
| 92.66455931573077 | 30.306 | 42.341 | 2494.675 | 2495.503 |
| 92.83190777240611 | 29.87 | 42.537 | 2493.301 | 2494.108 |
| 92.99925622908145 | 29.477 | 42.755 | 2491.862 | 2492.669 |
| 93.1666046857568 | 29.303 | 43.017 | 2490.249 | 2491.055 |
| 93.33395314243214 | 29.15 | 43.409 | 2489.464 | 2490.292 |
| 93.50130159910749 | 29.063 | 43.954 | 2489.616 | 2490.467 |
| 93.66865005578283 | 28.976 | 44.499 | 2489.791 | 2490.641 |
| 93.83599851245818 | 28.91 | 44.674 | 2490.707 | 2491.557 |
| 94.00334696913353 | 28.845 | 44.827 | 2491.644 | 2492.494 |
| 94.17069542580886 | 28.692 | 45.023 | 2493.497 | 2494.348 |
| 94.3380438824842 | 28.562 | 45.372 | 2496.114 | 2496.986 |
| 94.50539233915954 | 28.562 | 45.873 | 2498.926 | 2499.798 |
| 94.66344365935292 | 29.608 | 46.375 | 2501.717 | 2502.633 |
| 94.83079211602828 | 30.066 | 46.527 | 2503.636 | 2504.551 |
| 94.99814057270362 | 29.761 | 46.026 | 2505.598 | 2506.492 |
| 95.16548902937897 | 29.063 | 45.851 | 2508.65 | 2509.522 |
| 95.33283748605432 | 29.107 | 46.636 | 2509.871 | 2510.765 |
| 95.50018594272963 | 29.194 | 47.007 | 2511.179 | 2512.095 |
| 95.66753439940499 | 30.11 | 46.963 | 2511.964 | 2512.88 |
| 95.83488285608034 | 30.916 | 47.116 | 2511.877 | 2512.815 |
| 96.00223131275567 | 31.854 | 47.704 | 2510.787 | 2511.746 |
| 96.16957976943102 | 32.9 | 47.944 | 2508.301 | 2509.304 |
| 96.33692822610638 | 33.925 | 47.988 | 2504.987 | 2505.99 |
| 96.50427668278171 | 33.773 | 47.53 | 2499.646 | 2500.649 |
| 96.67162513945706 | 33.402 | 46.854 | 2492.451 | 2493.454 |
| 96.8389735961324 | 32.399 | 46.832 | 2490.118 | 2491.099 |
| 96.99702491632577 | 32.312 | 47.247 | 2487.829 | 2488.832 |
| 97.16437337300111 | 32.181 | 47.595 | 2486.673 | 2487.676 |
| 97.33172182967647 | 33.184 | 48.293 | 2485.932 | 2486.978 |
| 97.49907028635181 | 33.009 | 48.184 | 2484.58 | 2485.627 |
| 97.66641874302715 | 31.723 | 47.901 | 2483.381 | 2484.406 |
| 97.8337671997025 | 31.527 | 47.857 | 2484.166 | 2485.19 |
| 98.00111565637785 | 31.134 | 47.661 | 2484.689 | 2485.692 |
| 98.16846411305319 | 30.655 | 47.988 | 2484.754 | 2485.779 |
| 98.33581256972855 | 30.219 | 48.359 | 2484.994 | 2486.019 |
| 98.50316102640389 | 29.957 | 48.468 | 2484.885 | 2485.932 |
| 98.67050948307921 | 30.306 | 48.925 | 2485.648 | 2486.695 |
| 98.83785793975456 | 31.113 | 49.841 | 2486.717 | 2487.785 |
| 99.0052063964299 | 31.309 | 50.103 | 2486.782 | 2487.894 |
| 99.17255485310525 | 31.396 | 50.321 | 2486.651 | 2487.785 |
| 99.33060617329863 | 31.44 | 50.495 | 2486.368 | 2487.502 |
| 99.49795462997399 | 31.767 | 50.495 | 2486.106 | 2487.24 |
| 99.66530308664933 | 31.287 | 49.71 | 2485.256 | 2486.368 |
| 99.83265154332467 | 30.328 | 49.296 | 2485.19 | 2486.281 |
| 100.0 | 30.131 | 49.58 | 2485.19 | 2486.259 |